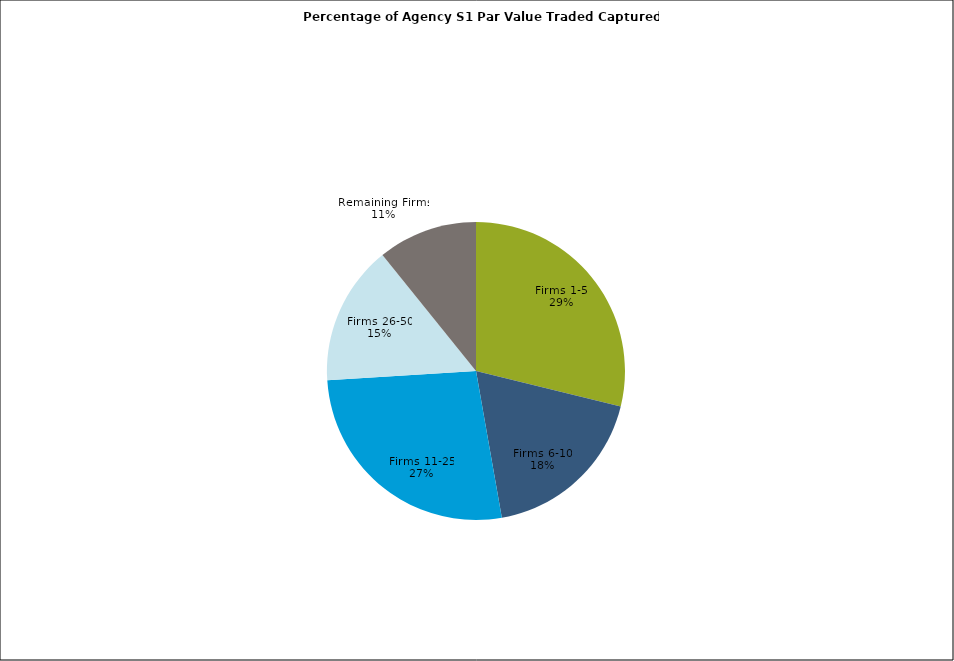
| Category | Series 0 |
|---|---|
| Firms 1-5 | 0.288 |
| Firms 6-10 | 0.184 |
| Firms 11-25 | 0.268 |
| Firms 26-50 | 0.152 |
| Remaining Firms | 0.108 |